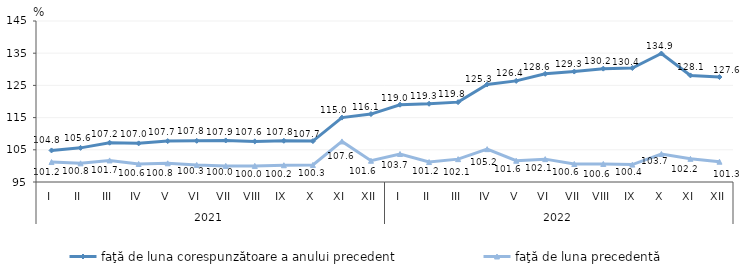
| Category | faţă de luna corespunzătoare a anului precedent | faţă de luna precedentă   |
|---|---|---|
| 0 | 104.8 | 101.2 |
| 1 | 105.6 | 100.8 |
| 2 | 107.2 | 101.7 |
| 3 | 107 | 100.6 |
| 4 | 107.7 | 100.8 |
| 5 | 107.8 | 100.3 |
| 6 | 107.9 | 100 |
| 7 | 107.6 | 100 |
| 8 | 107.8 | 100.2 |
| 9 | 107.7 | 100.3 |
| 10 | 115 | 107.6 |
| 11 | 116.1 | 101.6 |
| 12 | 119 | 103.7 |
| 13 | 119.3 | 101.2 |
| 14 | 119.8 | 102.1 |
| 15 | 125.3 | 105.2 |
| 16 | 126.4 | 101.6 |
| 17 | 128.6 | 102.1 |
| 18 | 129.3 | 100.6 |
| 19 | 130.2 | 100.6 |
| 20 | 130.4 | 100.4 |
| 21 | 134.9 | 103.7 |
| 22 | 128.1 | 102.2 |
| 23 | 127.6 | 101.3 |